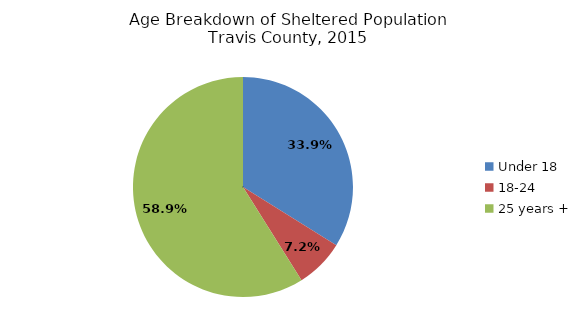
| Category | Percent of Total Sheltered |
|---|---|
| Under 18 | 0.339 |
| 18-24 | 0.072 |
| 25 years + | 0.589 |